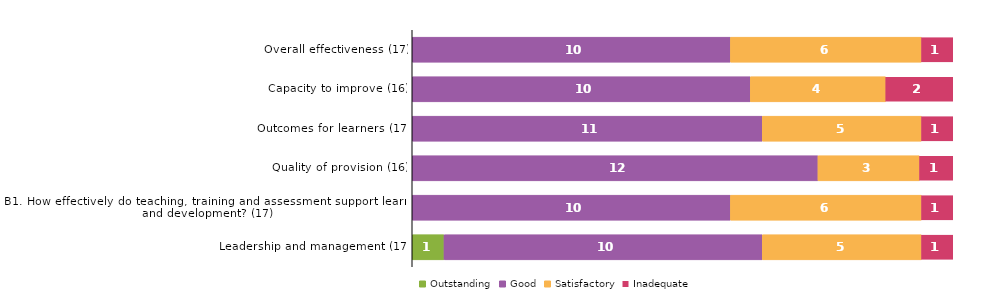
| Category | Outstanding | Good | Satisfactory | Inadequate |
|---|---|---|---|---|
| Overall effectiveness (17) | 0 | 10 | 6 | 1 |
| Capacity to improve (16) | 0 | 10 | 4 | 2 |
| Outcomes for learners (17) | 0 | 11 | 5 | 1 |
| Quality of provision (16) | 0 | 12 | 3 | 1 |
| B1. How effectively do teaching, training and assessment support learning and development? (17) | 0 | 10 | 6 | 1 |
| Leadership and management (17) | 1 | 10 | 5 | 1 |